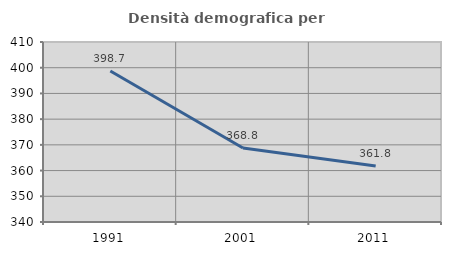
| Category | Densità demografica |
|---|---|
| 1991.0 | 398.698 |
| 2001.0 | 368.751 |
| 2011.0 | 361.758 |